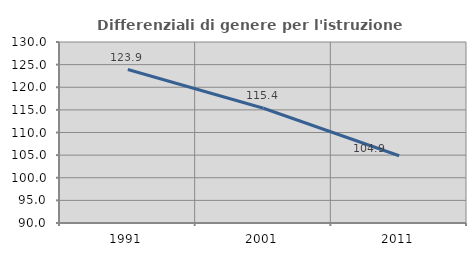
| Category | Differenziali di genere per l'istruzione superiore |
|---|---|
| 1991.0 | 123.911 |
| 2001.0 | 115.361 |
| 2011.0 | 104.866 |